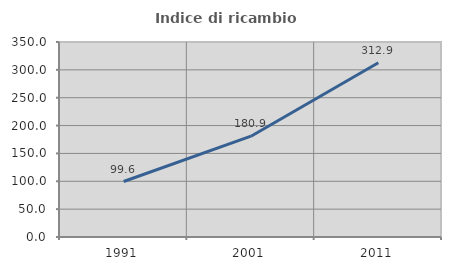
| Category | Indice di ricambio occupazionale  |
|---|---|
| 1991.0 | 99.552 |
| 2001.0 | 180.925 |
| 2011.0 | 312.879 |